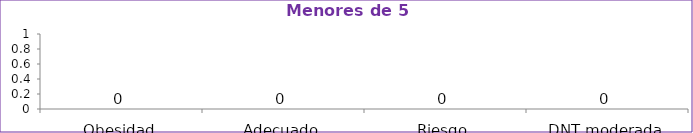
| Category | Series 0 |
|---|---|
| Obesidad | 0 |
| Adecuado | 0 |
| Riesgo | 0 |
| DNT moderada | 0 |